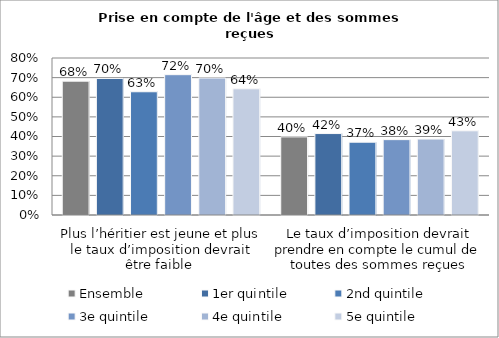
| Category | Ensemble | 1er quintile | 2nd quintile | 3e quintile | 4e quintile | 5e quintile |
|---|---|---|---|---|---|---|
| Plus l’héritier est jeune et plus le taux d’imposition devrait être faible  | 0.682 | 0.696 | 0.628 | 0.715 | 0.698 | 0.643 |
| Le taux d’imposition devrait prendre en compte le cumul de toutes des sommes reçues | 0.398 | 0.415 | 0.371 | 0.384 | 0.387 | 0.429 |